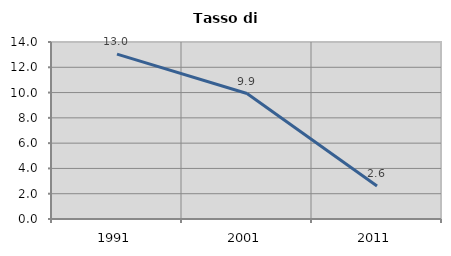
| Category | Tasso di disoccupazione   |
|---|---|
| 1991.0 | 13.038 |
| 2001.0 | 9.924 |
| 2011.0 | 2.616 |